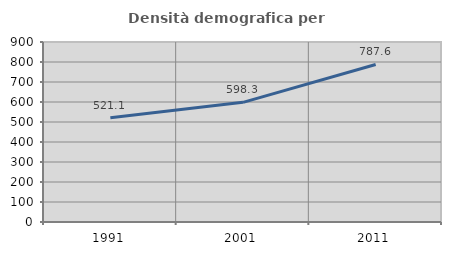
| Category | Densità demografica |
|---|---|
| 1991.0 | 521.068 |
| 2001.0 | 598.293 |
| 2011.0 | 787.637 |